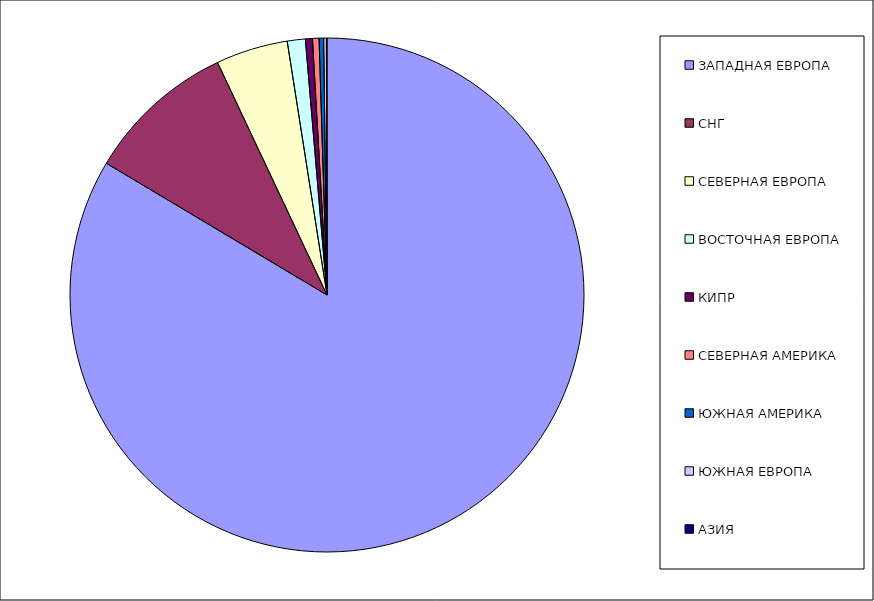
| Category | Оборот |
|---|---|
| ЗАПАДНАЯ ЕВРОПА | 0.836 |
| СНГ | 0.094 |
| СЕВЕРНАЯ ЕВРОПА | 0.045 |
| ВОСТОЧНАЯ ЕВРОПА | 0.011 |
| КИПР | 0.004 |
| СЕВЕРНАЯ АМЕРИКА | 0.004 |
| ЮЖНАЯ АМЕРИКА | 0.003 |
| ЮЖНАЯ ЕВРОПА | 0.002 |
| АЗИЯ | 0 |